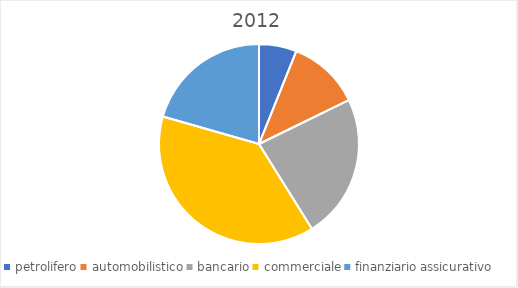
| Category | Series 0 |
|---|---|
| petrolifero | 13 |
| automobilistico | 25 |
| bancario | 50 |
| commerciale | 82 |
| finanziario assicurativo | 44 |